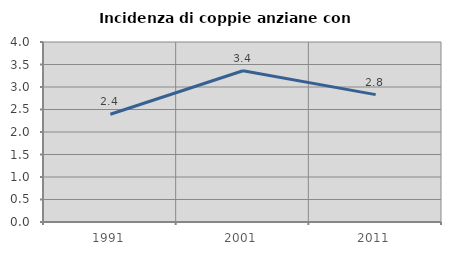
| Category | Incidenza di coppie anziane con figli |
|---|---|
| 1991.0 | 2.395 |
| 2001.0 | 3.361 |
| 2011.0 | 2.83 |